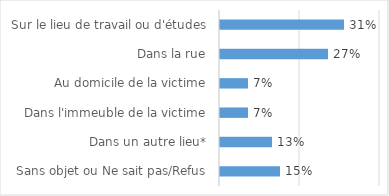
| Category | Series 0 |
|---|---|
| Sur le lieu de travail ou d'études  | 0.31 |
| Dans la rue | 0.27 |
| Au domicile de la victime | 0.07 |
| Dans l'immeuble de la victime | 0.07 |
| Dans un autre lieu* | 0.13 |
| Sans objet ou Ne sait pas/Refus | 0.15 |